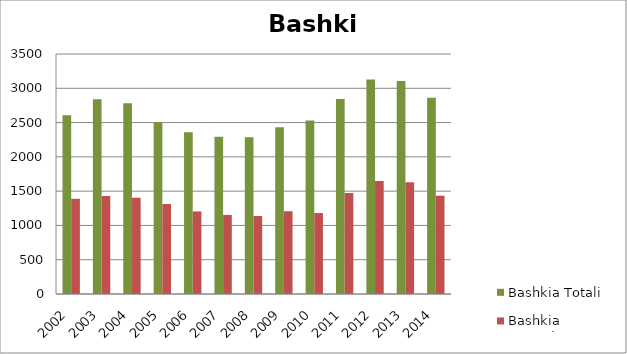
| Category | Bashkia Totali | Bashkia Gra/vajza |
|---|---|---|
| 2002.0 | 2608 | 1388 |
| 2003.0 | 2839 | 1428 |
| 2004.0 | 2781 | 1403 |
| 2005.0 | 2509 | 1311 |
| 2006.0 | 2360 | 1204 |
| 2007.0 | 2295 | 1153 |
| 2008.0 | 2287 | 1138 |
| 2009.0 | 2432 | 1207 |
| 2010.0 | 2532 | 1181 |
| 2011.0 | 2843 | 1474 |
| 2012.0 | 3129 | 1649 |
| 2013.0 | 3105 | 1631 |
| 2014.0 | 2861 | 1433 |